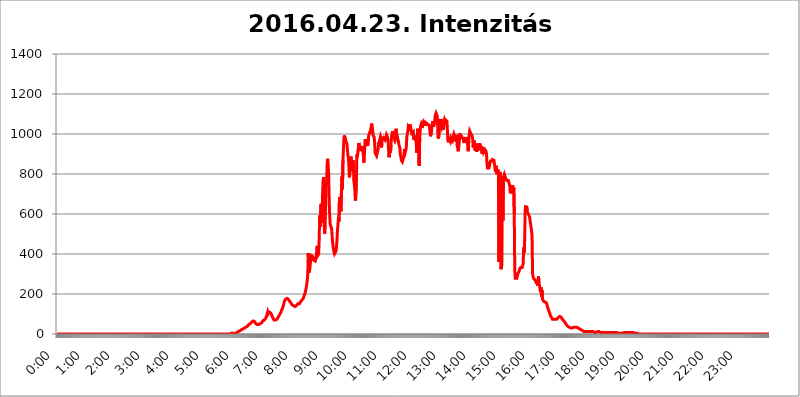
| Category | 2016.04.23. Intenzitás [W/m^2] |
|---|---|
| 0.0 | 0 |
| 0.0006944444444444445 | 0 |
| 0.001388888888888889 | 0 |
| 0.0020833333333333333 | 0 |
| 0.002777777777777778 | 0 |
| 0.003472222222222222 | 0 |
| 0.004166666666666667 | 0 |
| 0.004861111111111111 | 0 |
| 0.005555555555555556 | 0 |
| 0.0062499999999999995 | 0 |
| 0.006944444444444444 | 0 |
| 0.007638888888888889 | 0 |
| 0.008333333333333333 | 0 |
| 0.009027777777777779 | 0 |
| 0.009722222222222222 | 0 |
| 0.010416666666666666 | 0 |
| 0.011111111111111112 | 0 |
| 0.011805555555555555 | 0 |
| 0.012499999999999999 | 0 |
| 0.013194444444444444 | 0 |
| 0.013888888888888888 | 0 |
| 0.014583333333333332 | 0 |
| 0.015277777777777777 | 0 |
| 0.015972222222222224 | 0 |
| 0.016666666666666666 | 0 |
| 0.017361111111111112 | 0 |
| 0.018055555555555557 | 0 |
| 0.01875 | 0 |
| 0.019444444444444445 | 0 |
| 0.02013888888888889 | 0 |
| 0.020833333333333332 | 0 |
| 0.02152777777777778 | 0 |
| 0.022222222222222223 | 0 |
| 0.02291666666666667 | 0 |
| 0.02361111111111111 | 0 |
| 0.024305555555555556 | 0 |
| 0.024999999999999998 | 0 |
| 0.025694444444444447 | 0 |
| 0.02638888888888889 | 0 |
| 0.027083333333333334 | 0 |
| 0.027777777777777776 | 0 |
| 0.02847222222222222 | 0 |
| 0.029166666666666664 | 0 |
| 0.029861111111111113 | 0 |
| 0.030555555555555555 | 0 |
| 0.03125 | 0 |
| 0.03194444444444445 | 0 |
| 0.03263888888888889 | 0 |
| 0.03333333333333333 | 0 |
| 0.034027777777777775 | 0 |
| 0.034722222222222224 | 0 |
| 0.035416666666666666 | 0 |
| 0.036111111111111115 | 0 |
| 0.03680555555555556 | 0 |
| 0.0375 | 0 |
| 0.03819444444444444 | 0 |
| 0.03888888888888889 | 0 |
| 0.03958333333333333 | 0 |
| 0.04027777777777778 | 0 |
| 0.04097222222222222 | 0 |
| 0.041666666666666664 | 0 |
| 0.042361111111111106 | 0 |
| 0.04305555555555556 | 0 |
| 0.043750000000000004 | 0 |
| 0.044444444444444446 | 0 |
| 0.04513888888888889 | 0 |
| 0.04583333333333334 | 0 |
| 0.04652777777777778 | 0 |
| 0.04722222222222222 | 0 |
| 0.04791666666666666 | 0 |
| 0.04861111111111111 | 0 |
| 0.049305555555555554 | 0 |
| 0.049999999999999996 | 0 |
| 0.05069444444444445 | 0 |
| 0.051388888888888894 | 0 |
| 0.052083333333333336 | 0 |
| 0.05277777777777778 | 0 |
| 0.05347222222222222 | 0 |
| 0.05416666666666667 | 0 |
| 0.05486111111111111 | 0 |
| 0.05555555555555555 | 0 |
| 0.05625 | 0 |
| 0.05694444444444444 | 0 |
| 0.057638888888888885 | 0 |
| 0.05833333333333333 | 0 |
| 0.05902777777777778 | 0 |
| 0.059722222222222225 | 0 |
| 0.06041666666666667 | 0 |
| 0.061111111111111116 | 0 |
| 0.06180555555555556 | 0 |
| 0.0625 | 0 |
| 0.06319444444444444 | 0 |
| 0.06388888888888888 | 0 |
| 0.06458333333333334 | 0 |
| 0.06527777777777778 | 0 |
| 0.06597222222222222 | 0 |
| 0.06666666666666667 | 0 |
| 0.06736111111111111 | 0 |
| 0.06805555555555555 | 0 |
| 0.06874999999999999 | 0 |
| 0.06944444444444443 | 0 |
| 0.07013888888888889 | 0 |
| 0.07083333333333333 | 0 |
| 0.07152777777777779 | 0 |
| 0.07222222222222223 | 0 |
| 0.07291666666666667 | 0 |
| 0.07361111111111111 | 0 |
| 0.07430555555555556 | 0 |
| 0.075 | 0 |
| 0.07569444444444444 | 0 |
| 0.0763888888888889 | 0 |
| 0.07708333333333334 | 0 |
| 0.07777777777777778 | 0 |
| 0.07847222222222222 | 0 |
| 0.07916666666666666 | 0 |
| 0.0798611111111111 | 0 |
| 0.08055555555555556 | 0 |
| 0.08125 | 0 |
| 0.08194444444444444 | 0 |
| 0.08263888888888889 | 0 |
| 0.08333333333333333 | 0 |
| 0.08402777777777777 | 0 |
| 0.08472222222222221 | 0 |
| 0.08541666666666665 | 0 |
| 0.08611111111111112 | 0 |
| 0.08680555555555557 | 0 |
| 0.08750000000000001 | 0 |
| 0.08819444444444445 | 0 |
| 0.08888888888888889 | 0 |
| 0.08958333333333333 | 0 |
| 0.09027777777777778 | 0 |
| 0.09097222222222222 | 0 |
| 0.09166666666666667 | 0 |
| 0.09236111111111112 | 0 |
| 0.09305555555555556 | 0 |
| 0.09375 | 0 |
| 0.09444444444444444 | 0 |
| 0.09513888888888888 | 0 |
| 0.09583333333333333 | 0 |
| 0.09652777777777777 | 0 |
| 0.09722222222222222 | 0 |
| 0.09791666666666667 | 0 |
| 0.09861111111111111 | 0 |
| 0.09930555555555555 | 0 |
| 0.09999999999999999 | 0 |
| 0.10069444444444443 | 0 |
| 0.1013888888888889 | 0 |
| 0.10208333333333335 | 0 |
| 0.10277777777777779 | 0 |
| 0.10347222222222223 | 0 |
| 0.10416666666666667 | 0 |
| 0.10486111111111111 | 0 |
| 0.10555555555555556 | 0 |
| 0.10625 | 0 |
| 0.10694444444444444 | 0 |
| 0.1076388888888889 | 0 |
| 0.10833333333333334 | 0 |
| 0.10902777777777778 | 0 |
| 0.10972222222222222 | 0 |
| 0.1111111111111111 | 0 |
| 0.11180555555555556 | 0 |
| 0.11180555555555556 | 0 |
| 0.1125 | 0 |
| 0.11319444444444444 | 0 |
| 0.11388888888888889 | 0 |
| 0.11458333333333333 | 0 |
| 0.11527777777777777 | 0 |
| 0.11597222222222221 | 0 |
| 0.11666666666666665 | 0 |
| 0.1173611111111111 | 0 |
| 0.11805555555555557 | 0 |
| 0.11944444444444445 | 0 |
| 0.12013888888888889 | 0 |
| 0.12083333333333333 | 0 |
| 0.12152777777777778 | 0 |
| 0.12222222222222223 | 0 |
| 0.12291666666666667 | 0 |
| 0.12291666666666667 | 0 |
| 0.12361111111111112 | 0 |
| 0.12430555555555556 | 0 |
| 0.125 | 0 |
| 0.12569444444444444 | 0 |
| 0.12638888888888888 | 0 |
| 0.12708333333333333 | 0 |
| 0.16875 | 0 |
| 0.12847222222222224 | 0 |
| 0.12916666666666668 | 0 |
| 0.12986111111111112 | 0 |
| 0.13055555555555556 | 0 |
| 0.13125 | 0 |
| 0.13194444444444445 | 0 |
| 0.1326388888888889 | 0 |
| 0.13333333333333333 | 0 |
| 0.13402777777777777 | 0 |
| 0.13402777777777777 | 0 |
| 0.13472222222222222 | 0 |
| 0.13541666666666666 | 0 |
| 0.1361111111111111 | 0 |
| 0.13749999999999998 | 0 |
| 0.13819444444444443 | 0 |
| 0.1388888888888889 | 0 |
| 0.13958333333333334 | 0 |
| 0.14027777777777778 | 0 |
| 0.14097222222222222 | 0 |
| 0.14166666666666666 | 0 |
| 0.1423611111111111 | 0 |
| 0.14305555555555557 | 0 |
| 0.14375000000000002 | 0 |
| 0.14444444444444446 | 0 |
| 0.1451388888888889 | 0 |
| 0.1451388888888889 | 0 |
| 0.14652777777777778 | 0 |
| 0.14722222222222223 | 0 |
| 0.14791666666666667 | 0 |
| 0.1486111111111111 | 0 |
| 0.14930555555555555 | 0 |
| 0.15 | 0 |
| 0.15069444444444444 | 0 |
| 0.15138888888888888 | 0 |
| 0.15208333333333332 | 0 |
| 0.15277777777777776 | 0 |
| 0.15347222222222223 | 0 |
| 0.15416666666666667 | 0 |
| 0.15486111111111112 | 0 |
| 0.15555555555555556 | 0 |
| 0.15625 | 0 |
| 0.15694444444444444 | 0 |
| 0.15763888888888888 | 0 |
| 0.15833333333333333 | 0 |
| 0.15902777777777777 | 0 |
| 0.15972222222222224 | 0 |
| 0.16041666666666668 | 0 |
| 0.16111111111111112 | 0 |
| 0.16180555555555556 | 0 |
| 0.1625 | 0 |
| 0.16319444444444445 | 0 |
| 0.1638888888888889 | 0 |
| 0.16458333333333333 | 0 |
| 0.16527777777777777 | 0 |
| 0.16597222222222222 | 0 |
| 0.16666666666666666 | 0 |
| 0.1673611111111111 | 0 |
| 0.16805555555555554 | 0 |
| 0.16874999999999998 | 0 |
| 0.16944444444444443 | 0 |
| 0.17013888888888887 | 0 |
| 0.1708333333333333 | 0 |
| 0.17152777777777775 | 0 |
| 0.17222222222222225 | 0 |
| 0.1729166666666667 | 0 |
| 0.17361111111111113 | 0 |
| 0.17430555555555557 | 0 |
| 0.17500000000000002 | 0 |
| 0.17569444444444446 | 0 |
| 0.1763888888888889 | 0 |
| 0.17708333333333334 | 0 |
| 0.17777777777777778 | 0 |
| 0.17847222222222223 | 0 |
| 0.17916666666666667 | 0 |
| 0.1798611111111111 | 0 |
| 0.18055555555555555 | 0 |
| 0.18125 | 0 |
| 0.18194444444444444 | 0 |
| 0.1826388888888889 | 0 |
| 0.18333333333333335 | 0 |
| 0.1840277777777778 | 0 |
| 0.18472222222222223 | 0 |
| 0.18541666666666667 | 0 |
| 0.18611111111111112 | 0 |
| 0.18680555555555556 | 0 |
| 0.1875 | 0 |
| 0.18819444444444444 | 0 |
| 0.18888888888888888 | 0 |
| 0.18958333333333333 | 0 |
| 0.19027777777777777 | 0 |
| 0.1909722222222222 | 0 |
| 0.19166666666666665 | 0 |
| 0.19236111111111112 | 0 |
| 0.19305555555555554 | 0 |
| 0.19375 | 0 |
| 0.19444444444444445 | 0 |
| 0.1951388888888889 | 0 |
| 0.19583333333333333 | 0 |
| 0.19652777777777777 | 0 |
| 0.19722222222222222 | 0 |
| 0.19791666666666666 | 0 |
| 0.1986111111111111 | 0 |
| 0.19930555555555554 | 0 |
| 0.19999999999999998 | 0 |
| 0.20069444444444443 | 0 |
| 0.20138888888888887 | 0 |
| 0.2020833333333333 | 0 |
| 0.2027777777777778 | 0 |
| 0.2034722222222222 | 0 |
| 0.2041666666666667 | 0 |
| 0.20486111111111113 | 0 |
| 0.20555555555555557 | 0 |
| 0.20625000000000002 | 0 |
| 0.20694444444444446 | 0 |
| 0.2076388888888889 | 0 |
| 0.20833333333333334 | 0 |
| 0.20902777777777778 | 0 |
| 0.20972222222222223 | 0 |
| 0.21041666666666667 | 0 |
| 0.2111111111111111 | 0 |
| 0.21180555555555555 | 0 |
| 0.2125 | 0 |
| 0.21319444444444444 | 0 |
| 0.2138888888888889 | 0 |
| 0.21458333333333335 | 0 |
| 0.2152777777777778 | 0 |
| 0.21597222222222223 | 0 |
| 0.21666666666666667 | 0 |
| 0.21736111111111112 | 0 |
| 0.21805555555555556 | 0 |
| 0.21875 | 0 |
| 0.21944444444444444 | 0 |
| 0.22013888888888888 | 0 |
| 0.22083333333333333 | 0 |
| 0.22152777777777777 | 0 |
| 0.2222222222222222 | 0 |
| 0.22291666666666665 | 0 |
| 0.2236111111111111 | 0 |
| 0.22430555555555556 | 0 |
| 0.225 | 0 |
| 0.22569444444444445 | 0 |
| 0.2263888888888889 | 0 |
| 0.22708333333333333 | 0 |
| 0.22777777777777777 | 0 |
| 0.22847222222222222 | 0 |
| 0.22916666666666666 | 0 |
| 0.2298611111111111 | 0 |
| 0.23055555555555554 | 0 |
| 0.23124999999999998 | 0 |
| 0.23194444444444443 | 0 |
| 0.23263888888888887 | 0 |
| 0.2333333333333333 | 0 |
| 0.2340277777777778 | 0 |
| 0.2347222222222222 | 0 |
| 0.2354166666666667 | 0 |
| 0.23611111111111113 | 0 |
| 0.23680555555555557 | 0 |
| 0.23750000000000002 | 0 |
| 0.23819444444444446 | 0 |
| 0.2388888888888889 | 0 |
| 0.23958333333333334 | 0 |
| 0.24027777777777778 | 0 |
| 0.24097222222222223 | 0 |
| 0.24166666666666667 | 0 |
| 0.2423611111111111 | 0 |
| 0.24305555555555555 | 3.525 |
| 0.24375 | 3.525 |
| 0.24444444444444446 | 3.525 |
| 0.24513888888888888 | 3.525 |
| 0.24583333333333335 | 3.525 |
| 0.2465277777777778 | 3.525 |
| 0.24722222222222223 | 3.525 |
| 0.24791666666666667 | 3.525 |
| 0.24861111111111112 | 3.525 |
| 0.24930555555555556 | 3.525 |
| 0.25 | 3.525 |
| 0.25069444444444444 | 3.525 |
| 0.2513888888888889 | 7.887 |
| 0.2520833333333333 | 7.887 |
| 0.25277777777777777 | 7.887 |
| 0.2534722222222222 | 12.257 |
| 0.25416666666666665 | 12.257 |
| 0.2548611111111111 | 12.257 |
| 0.2555555555555556 | 12.257 |
| 0.25625000000000003 | 16.636 |
| 0.2569444444444445 | 16.636 |
| 0.2576388888888889 | 16.636 |
| 0.25833333333333336 | 21.024 |
| 0.2590277777777778 | 21.024 |
| 0.25972222222222224 | 25.419 |
| 0.2604166666666667 | 25.419 |
| 0.2611111111111111 | 29.823 |
| 0.26180555555555557 | 29.823 |
| 0.2625 | 29.823 |
| 0.26319444444444445 | 29.823 |
| 0.2638888888888889 | 29.823 |
| 0.26458333333333334 | 34.234 |
| 0.2652777777777778 | 34.234 |
| 0.2659722222222222 | 38.653 |
| 0.26666666666666666 | 38.653 |
| 0.2673611111111111 | 38.653 |
| 0.26805555555555555 | 43.079 |
| 0.26875 | 47.511 |
| 0.26944444444444443 | 47.511 |
| 0.2701388888888889 | 51.951 |
| 0.2708333333333333 | 51.951 |
| 0.27152777777777776 | 56.398 |
| 0.2722222222222222 | 56.398 |
| 0.27291666666666664 | 60.85 |
| 0.2736111111111111 | 60.85 |
| 0.2743055555555555 | 65.31 |
| 0.27499999999999997 | 65.31 |
| 0.27569444444444446 | 60.85 |
| 0.27638888888888885 | 60.85 |
| 0.27708333333333335 | 60.85 |
| 0.2777777777777778 | 56.398 |
| 0.27847222222222223 | 51.951 |
| 0.2791666666666667 | 51.951 |
| 0.2798611111111111 | 47.511 |
| 0.28055555555555556 | 47.511 |
| 0.28125 | 47.511 |
| 0.28194444444444444 | 47.511 |
| 0.2826388888888889 | 47.511 |
| 0.2833333333333333 | 47.511 |
| 0.28402777777777777 | 47.511 |
| 0.2847222222222222 | 51.951 |
| 0.28541666666666665 | 56.398 |
| 0.28611111111111115 | 56.398 |
| 0.28680555555555554 | 56.398 |
| 0.28750000000000003 | 60.85 |
| 0.2881944444444445 | 65.31 |
| 0.2888888888888889 | 65.31 |
| 0.28958333333333336 | 69.775 |
| 0.2902777777777778 | 69.775 |
| 0.29097222222222224 | 74.246 |
| 0.2916666666666667 | 74.246 |
| 0.2923611111111111 | 78.722 |
| 0.29305555555555557 | 83.205 |
| 0.29375 | 92.184 |
| 0.29444444444444445 | 96.682 |
| 0.2951388888888889 | 110.201 |
| 0.29583333333333334 | 101.184 |
| 0.2965277777777778 | 101.184 |
| 0.2972222222222222 | 110.201 |
| 0.29791666666666666 | 114.716 |
| 0.2986111111111111 | 105.69 |
| 0.29930555555555555 | 105.69 |
| 0.3 | 101.184 |
| 0.30069444444444443 | 96.682 |
| 0.3013888888888889 | 87.692 |
| 0.3020833333333333 | 83.205 |
| 0.30277777777777776 | 78.722 |
| 0.3034722222222222 | 74.246 |
| 0.30416666666666664 | 69.775 |
| 0.3048611111111111 | 69.775 |
| 0.3055555555555555 | 69.775 |
| 0.30624999999999997 | 69.775 |
| 0.3069444444444444 | 69.775 |
| 0.3076388888888889 | 74.246 |
| 0.30833333333333335 | 74.246 |
| 0.3090277777777778 | 78.722 |
| 0.30972222222222223 | 83.205 |
| 0.3104166666666667 | 87.692 |
| 0.3111111111111111 | 92.184 |
| 0.31180555555555556 | 96.682 |
| 0.3125 | 101.184 |
| 0.31319444444444444 | 105.69 |
| 0.3138888888888889 | 110.201 |
| 0.3145833333333333 | 119.235 |
| 0.31527777777777777 | 123.758 |
| 0.3159722222222222 | 128.284 |
| 0.31666666666666665 | 137.347 |
| 0.31736111111111115 | 146.423 |
| 0.31805555555555554 | 155.509 |
| 0.31875000000000003 | 164.605 |
| 0.3194444444444445 | 169.156 |
| 0.3201388888888889 | 173.709 |
| 0.32083333333333336 | 173.709 |
| 0.3215277777777778 | 178.264 |
| 0.32222222222222224 | 178.264 |
| 0.3229166666666667 | 178.264 |
| 0.3236111111111111 | 178.264 |
| 0.32430555555555557 | 173.709 |
| 0.325 | 169.156 |
| 0.32569444444444445 | 164.605 |
| 0.3263888888888889 | 160.056 |
| 0.32708333333333334 | 160.056 |
| 0.3277777777777778 | 155.509 |
| 0.3284722222222222 | 150.964 |
| 0.32916666666666666 | 146.423 |
| 0.3298611111111111 | 146.423 |
| 0.33055555555555555 | 141.884 |
| 0.33125 | 141.884 |
| 0.33194444444444443 | 137.347 |
| 0.3326388888888889 | 137.347 |
| 0.3333333333333333 | 137.347 |
| 0.3340277777777778 | 137.347 |
| 0.3347222222222222 | 141.884 |
| 0.3354166666666667 | 141.884 |
| 0.3361111111111111 | 146.423 |
| 0.3368055555555556 | 146.423 |
| 0.33749999999999997 | 150.964 |
| 0.33819444444444446 | 150.964 |
| 0.33888888888888885 | 150.964 |
| 0.33958333333333335 | 150.964 |
| 0.34027777777777773 | 155.509 |
| 0.34097222222222223 | 160.056 |
| 0.3416666666666666 | 160.056 |
| 0.3423611111111111 | 164.605 |
| 0.3430555555555555 | 169.156 |
| 0.34375 | 173.709 |
| 0.3444444444444445 | 173.709 |
| 0.3451388888888889 | 178.264 |
| 0.3458333333333334 | 187.378 |
| 0.34652777777777777 | 191.937 |
| 0.34722222222222227 | 201.058 |
| 0.34791666666666665 | 210.182 |
| 0.34861111111111115 | 219.309 |
| 0.34930555555555554 | 233 |
| 0.35000000000000003 | 251.251 |
| 0.3506944444444444 | 269.49 |
| 0.3513888888888889 | 301.354 |
| 0.3520833333333333 | 405.108 |
| 0.3527777777777778 | 305.898 |
| 0.3534722222222222 | 305.898 |
| 0.3541666666666667 | 324.052 |
| 0.3548611111111111 | 346.682 |
| 0.35555555555555557 | 373.729 |
| 0.35625 | 391.685 |
| 0.35694444444444445 | 396.164 |
| 0.3576388888888889 | 396.164 |
| 0.35833333333333334 | 387.202 |
| 0.3590277777777778 | 378.224 |
| 0.3597222222222222 | 369.23 |
| 0.36041666666666666 | 364.728 |
| 0.3611111111111111 | 364.728 |
| 0.36180555555555555 | 364.728 |
| 0.3625 | 369.23 |
| 0.36319444444444443 | 387.202 |
| 0.3638888888888889 | 414.035 |
| 0.3645833333333333 | 440.702 |
| 0.3652777777777778 | 391.685 |
| 0.3659722222222222 | 387.202 |
| 0.3666666666666667 | 400.638 |
| 0.3673611111111111 | 471.582 |
| 0.3680555555555556 | 592.233 |
| 0.36874999999999997 | 536.82 |
| 0.36944444444444446 | 541.121 |
| 0.37013888888888885 | 650.667 |
| 0.37083333333333335 | 558.261 |
| 0.37152777777777773 | 617.436 |
| 0.37222222222222223 | 703.762 |
| 0.3729166666666666 | 767.62 |
| 0.3736111111111111 | 783.342 |
| 0.3743055555555555 | 558.261 |
| 0.375 | 502.192 |
| 0.3756944444444445 | 545.416 |
| 0.3763888888888889 | 629.948 |
| 0.3770833333333334 | 731.896 |
| 0.37777777777777777 | 755.766 |
| 0.37847222222222227 | 845.365 |
| 0.37916666666666665 | 875.918 |
| 0.37986111111111115 | 833.834 |
| 0.38055555555555554 | 818.392 |
| 0.38125000000000003 | 691.608 |
| 0.3819444444444444 | 609.062 |
| 0.3826388888888889 | 553.986 |
| 0.3833333333333333 | 541.121 |
| 0.3840277777777778 | 536.82 |
| 0.3847222222222222 | 528.2 |
| 0.3854166666666667 | 497.836 |
| 0.3861111111111111 | 462.786 |
| 0.38680555555555557 | 440.702 |
| 0.3875 | 422.943 |
| 0.38819444444444445 | 409.574 |
| 0.3888888888888889 | 400.638 |
| 0.38958333333333334 | 396.164 |
| 0.3902777777777778 | 405.108 |
| 0.3909722222222222 | 414.035 |
| 0.39166666666666666 | 436.27 |
| 0.3923611111111111 | 471.582 |
| 0.39305555555555555 | 519.555 |
| 0.39375 | 549.704 |
| 0.39444444444444443 | 583.779 |
| 0.3951388888888889 | 562.53 |
| 0.3958333333333333 | 683.473 |
| 0.3965277777777778 | 658.909 |
| 0.3972222222222222 | 663.019 |
| 0.3979166666666667 | 613.252 |
| 0.3986111111111111 | 715.858 |
| 0.3993055555555556 | 787.258 |
| 0.39999999999999997 | 723.889 |
| 0.40069444444444446 | 868.305 |
| 0.40138888888888885 | 921.298 |
| 0.40208333333333335 | 977.508 |
| 0.40277777777777773 | 992.448 |
| 0.40347222222222223 | 992.448 |
| 0.4041666666666666 | 996.182 |
| 0.4048611111111111 | 962.555 |
| 0.4055555555555555 | 966.295 |
| 0.40625 | 951.327 |
| 0.4069444444444445 | 955.071 |
| 0.4076388888888889 | 894.885 |
| 0.4083333333333334 | 883.516 |
| 0.40902777777777777 | 837.682 |
| 0.40972222222222227 | 783.342 |
| 0.41041666666666665 | 802.868 |
| 0.41111111111111115 | 875.918 |
| 0.41180555555555554 | 887.309 |
| 0.41250000000000003 | 872.114 |
| 0.4131944444444444 | 837.682 |
| 0.4138888888888889 | 814.519 |
| 0.4145833333333333 | 868.305 |
| 0.4152777777777778 | 856.855 |
| 0.4159722222222222 | 767.62 |
| 0.4166666666666667 | 767.62 |
| 0.4173611111111111 | 723.889 |
| 0.41805555555555557 | 667.123 |
| 0.41875 | 683.473 |
| 0.41944444444444445 | 719.877 |
| 0.4201388888888889 | 898.668 |
| 0.42083333333333334 | 891.099 |
| 0.4215277777777778 | 902.447 |
| 0.4222222222222222 | 928.819 |
| 0.42291666666666666 | 955.071 |
| 0.4236111111111111 | 925.06 |
| 0.42430555555555555 | 932.576 |
| 0.425 | 921.298 |
| 0.42569444444444443 | 917.534 |
| 0.4263888888888889 | 921.298 |
| 0.4270833333333333 | 921.298 |
| 0.4277777777777778 | 932.576 |
| 0.4284722222222222 | 940.082 |
| 0.4291666666666667 | 902.447 |
| 0.4298611111111111 | 856.855 |
| 0.4305555555555556 | 883.516 |
| 0.43124999999999997 | 883.516 |
| 0.43194444444444446 | 973.772 |
| 0.43263888888888885 | 958.814 |
| 0.43333333333333335 | 973.772 |
| 0.43402777777777773 | 962.555 |
| 0.43472222222222223 | 947.58 |
| 0.4354166666666666 | 940.082 |
| 0.4361111111111111 | 943.832 |
| 0.4368055555555555 | 992.448 |
| 0.4375 | 988.714 |
| 0.4381944444444445 | 1007.383 |
| 0.4388888888888889 | 1014.852 |
| 0.4395833333333334 | 999.916 |
| 0.44027777777777777 | 1033.537 |
| 0.44097222222222227 | 1052.255 |
| 0.44166666666666665 | 1029.798 |
| 0.44236111111111115 | 1022.323 |
| 0.44305555555555554 | 992.448 |
| 0.44375000000000003 | 988.714 |
| 0.4444444444444444 | 984.98 |
| 0.4451388888888889 | 958.814 |
| 0.4458333333333333 | 906.223 |
| 0.4465277777777778 | 902.447 |
| 0.4472222222222222 | 902.447 |
| 0.4479166666666667 | 891.099 |
| 0.4486111111111111 | 894.885 |
| 0.44930555555555557 | 887.309 |
| 0.45 | 921.298 |
| 0.45069444444444445 | 955.071 |
| 0.4513888888888889 | 955.071 |
| 0.45208333333333334 | 966.295 |
| 0.4527777777777778 | 977.508 |
| 0.4534722222222222 | 988.714 |
| 0.45416666666666666 | 981.244 |
| 0.4548611111111111 | 932.576 |
| 0.45555555555555555 | 984.98 |
| 0.45625 | 973.772 |
| 0.45694444444444443 | 977.508 |
| 0.4576388888888889 | 981.244 |
| 0.4583333333333333 | 981.244 |
| 0.4590277777777778 | 977.508 |
| 0.4597222222222222 | 970.034 |
| 0.4604166666666667 | 973.772 |
| 0.4611111111111111 | 984.98 |
| 0.4618055555555556 | 996.182 |
| 0.46249999999999997 | 992.448 |
| 0.46319444444444446 | 984.98 |
| 0.46388888888888885 | 970.034 |
| 0.46458333333333335 | 932.576 |
| 0.46527777777777773 | 883.516 |
| 0.46597222222222223 | 887.309 |
| 0.4666666666666666 | 925.06 |
| 0.4673611111111111 | 906.223 |
| 0.4680555555555555 | 943.832 |
| 0.46875 | 984.98 |
| 0.4694444444444445 | 999.916 |
| 0.4701388888888889 | 1014.852 |
| 0.4708333333333334 | 996.182 |
| 0.47152777777777777 | 984.98 |
| 0.47222222222222227 | 984.98 |
| 0.47291666666666665 | 984.98 |
| 0.47361111111111115 | 966.295 |
| 0.47430555555555554 | 973.772 |
| 0.47500000000000003 | 1026.06 |
| 0.4756944444444444 | 1007.383 |
| 0.4763888888888889 | 996.182 |
| 0.4770833333333333 | 996.182 |
| 0.4777777777777778 | 973.772 |
| 0.4784722222222222 | 962.555 |
| 0.4791666666666667 | 947.58 |
| 0.4798611111111111 | 951.327 |
| 0.48055555555555557 | 928.819 |
| 0.48125 | 894.885 |
| 0.48194444444444445 | 887.309 |
| 0.4826388888888889 | 868.305 |
| 0.48333333333333334 | 868.305 |
| 0.4840277777777778 | 860.676 |
| 0.4847222222222222 | 856.855 |
| 0.48541666666666666 | 864.493 |
| 0.4861111111111111 | 887.309 |
| 0.48680555555555555 | 925.06 |
| 0.4875 | 917.534 |
| 0.48819444444444443 | 909.996 |
| 0.4888888888888889 | 909.996 |
| 0.4895833333333333 | 932.576 |
| 0.4902777777777778 | 984.98 |
| 0.4909722222222222 | 999.916 |
| 0.4916666666666667 | 1014.852 |
| 0.4923611111111111 | 1037.277 |
| 0.4930555555555556 | 1037.277 |
| 0.49374999999999997 | 1029.798 |
| 0.49444444444444446 | 1048.508 |
| 0.49513888888888885 | 1041.019 |
| 0.49583333333333335 | 1029.798 |
| 0.49652777777777773 | 1014.852 |
| 0.49722222222222223 | 1003.65 |
| 0.4979166666666666 | 1007.383 |
| 0.4986111111111111 | 1007.383 |
| 0.4993055555555555 | 1011.118 |
| 0.5 | 970.034 |
| 0.5006944444444444 | 966.295 |
| 0.5013888888888889 | 981.244 |
| 0.5020833333333333 | 984.98 |
| 0.5027777777777778 | 992.448 |
| 0.5034722222222222 | 958.814 |
| 0.5041666666666667 | 906.223 |
| 0.5048611111111111 | 909.996 |
| 0.5055555555555555 | 1026.06 |
| 0.50625 | 958.814 |
| 0.5069444444444444 | 970.034 |
| 0.5076388888888889 | 841.526 |
| 0.5083333333333333 | 977.508 |
| 0.5090277777777777 | 1018.587 |
| 0.5097222222222222 | 1041.019 |
| 0.5104166666666666 | 1048.508 |
| 0.5111111111111112 | 1048.508 |
| 0.5118055555555555 | 1029.798 |
| 0.5125000000000001 | 1052.255 |
| 0.5131944444444444 | 1056.004 |
| 0.513888888888889 | 1063.51 |
| 0.5145833333333333 | 1059.756 |
| 0.5152777777777778 | 1056.004 |
| 0.5159722222222222 | 1041.019 |
| 0.5166666666666667 | 1041.019 |
| 0.517361111111111 | 1056.004 |
| 0.5180555555555556 | 1059.756 |
| 0.5187499999999999 | 1056.004 |
| 0.5194444444444445 | 1048.508 |
| 0.5201388888888888 | 1052.255 |
| 0.5208333333333334 | 1044.762 |
| 0.5215277777777778 | 1044.762 |
| 0.5222222222222223 | 1029.798 |
| 0.5229166666666667 | 1007.383 |
| 0.5236111111111111 | 988.714 |
| 0.5243055555555556 | 992.448 |
| 0.525 | 1018.587 |
| 0.5256944444444445 | 1041.019 |
| 0.5263888888888889 | 1056.004 |
| 0.5270833333333333 | 1063.51 |
| 0.5277777777777778 | 1037.277 |
| 0.5284722222222222 | 1044.762 |
| 0.5291666666666667 | 1059.756 |
| 0.5298611111111111 | 1082.324 |
| 0.5305555555555556 | 1097.437 |
| 0.53125 | 1105.019 |
| 0.5319444444444444 | 1101.226 |
| 0.5326388888888889 | 1093.653 |
| 0.5333333333333333 | 1063.51 |
| 0.5340277777777778 | 984.98 |
| 0.5347222222222222 | 977.508 |
| 0.5354166666666667 | 1003.65 |
| 0.5361111111111111 | 1022.323 |
| 0.5368055555555555 | 1074.789 |
| 0.5375 | 1059.756 |
| 0.5381944444444444 | 1074.789 |
| 0.5388888888888889 | 1044.762 |
| 0.5395833333333333 | 1033.537 |
| 0.5402777777777777 | 1033.537 |
| 0.5409722222222222 | 1048.508 |
| 0.5416666666666666 | 1022.323 |
| 0.5423611111111112 | 1059.756 |
| 0.5430555555555555 | 1071.027 |
| 0.5437500000000001 | 1063.51 |
| 0.5444444444444444 | 1071.027 |
| 0.545138888888889 | 1074.789 |
| 0.5458333333333333 | 1071.027 |
| 0.5465277777777778 | 1063.51 |
| 0.5472222222222222 | 1018.587 |
| 0.5479166666666667 | 966.295 |
| 0.548611111111111 | 958.814 |
| 0.5493055555555556 | 984.98 |
| 0.5499999999999999 | 984.98 |
| 0.5506944444444445 | 970.034 |
| 0.5513888888888888 | 977.508 |
| 0.5520833333333334 | 966.295 |
| 0.5527777777777778 | 973.772 |
| 0.5534722222222223 | 970.034 |
| 0.5541666666666667 | 966.295 |
| 0.5548611111111111 | 981.244 |
| 0.5555555555555556 | 984.98 |
| 0.55625 | 999.916 |
| 0.5569444444444445 | 999.916 |
| 0.5576388888888889 | 996.182 |
| 0.5583333333333333 | 977.508 |
| 0.5590277777777778 | 962.555 |
| 0.5597222222222222 | 973.772 |
| 0.5604166666666667 | 996.182 |
| 0.5611111111111111 | 940.082 |
| 0.5618055555555556 | 940.082 |
| 0.5625 | 913.766 |
| 0.5631944444444444 | 943.832 |
| 0.5638888888888889 | 962.555 |
| 0.5645833333333333 | 1003.65 |
| 0.5652777777777778 | 992.448 |
| 0.5659722222222222 | 977.508 |
| 0.5666666666666667 | 992.448 |
| 0.5673611111111111 | 984.98 |
| 0.5680555555555555 | 984.98 |
| 0.56875 | 977.508 |
| 0.5694444444444444 | 984.98 |
| 0.5701388888888889 | 962.555 |
| 0.5708333333333333 | 955.071 |
| 0.5715277777777777 | 973.772 |
| 0.5722222222222222 | 984.98 |
| 0.5729166666666666 | 966.295 |
| 0.5736111111111112 | 955.071 |
| 0.5743055555555555 | 984.98 |
| 0.5750000000000001 | 970.034 |
| 0.5756944444444444 | 970.034 |
| 0.576388888888889 | 913.766 |
| 0.5770833333333333 | 962.555 |
| 0.5777777777777778 | 996.182 |
| 0.5784722222222222 | 1014.852 |
| 0.5791666666666667 | 1011.118 |
| 0.579861111111111 | 1003.65 |
| 0.5805555555555556 | 999.916 |
| 0.5812499999999999 | 999.916 |
| 0.5819444444444445 | 988.714 |
| 0.5826388888888888 | 977.508 |
| 0.5833333333333334 | 932.576 |
| 0.5840277777777778 | 947.58 |
| 0.5847222222222223 | 966.295 |
| 0.5854166666666667 | 951.327 |
| 0.5861111111111111 | 917.534 |
| 0.5868055555555556 | 951.327 |
| 0.5875 | 940.082 |
| 0.5881944444444445 | 909.996 |
| 0.5888888888888889 | 947.58 |
| 0.5895833333333333 | 917.534 |
| 0.5902777777777778 | 940.082 |
| 0.5909722222222222 | 947.58 |
| 0.5916666666666667 | 943.832 |
| 0.5923611111111111 | 943.832 |
| 0.5930555555555556 | 947.58 |
| 0.59375 | 940.082 |
| 0.5944444444444444 | 917.534 |
| 0.5951388888888889 | 940.082 |
| 0.5958333333333333 | 902.447 |
| 0.5965277777777778 | 932.576 |
| 0.5972222222222222 | 928.819 |
| 0.5979166666666667 | 906.223 |
| 0.5986111111111111 | 902.447 |
| 0.5993055555555555 | 913.766 |
| 0.6 | 921.298 |
| 0.6006944444444444 | 921.298 |
| 0.6013888888888889 | 913.766 |
| 0.6020833333333333 | 898.668 |
| 0.6027777777777777 | 849.199 |
| 0.6034722222222222 | 829.981 |
| 0.6041666666666666 | 829.981 |
| 0.6048611111111112 | 826.123 |
| 0.6055555555555555 | 829.981 |
| 0.6062500000000001 | 829.981 |
| 0.6069444444444444 | 856.855 |
| 0.607638888888889 | 864.493 |
| 0.6083333333333333 | 868.305 |
| 0.6090277777777778 | 864.493 |
| 0.6097222222222222 | 864.493 |
| 0.6104166666666667 | 872.114 |
| 0.611111111111111 | 872.114 |
| 0.6118055555555556 | 868.305 |
| 0.6124999999999999 | 868.305 |
| 0.6131944444444445 | 868.305 |
| 0.6138888888888888 | 864.493 |
| 0.6145833333333334 | 810.641 |
| 0.6152777777777778 | 841.526 |
| 0.6159722222222223 | 806.757 |
| 0.6166666666666667 | 798.974 |
| 0.6173611111111111 | 795.074 |
| 0.6180555555555556 | 822.26 |
| 0.61875 | 798.974 |
| 0.6194444444444445 | 360.221 |
| 0.6201388888888889 | 798.974 |
| 0.6208333333333333 | 810.641 |
| 0.6215277777777778 | 783.342 |
| 0.6222222222222222 | 324.052 |
| 0.6229166666666667 | 319.517 |
| 0.6236111111111111 | 351.198 |
| 0.6243055555555556 | 787.258 |
| 0.625 | 566.793 |
| 0.6256944444444444 | 783.342 |
| 0.6263888888888889 | 791.169 |
| 0.6270833333333333 | 798.974 |
| 0.6277777777777778 | 791.169 |
| 0.6284722222222222 | 783.342 |
| 0.6291666666666667 | 787.258 |
| 0.6298611111111111 | 787.258 |
| 0.6305555555555555 | 767.62 |
| 0.63125 | 767.62 |
| 0.6319444444444444 | 763.674 |
| 0.6326388888888889 | 767.62 |
| 0.6333333333333333 | 759.723 |
| 0.6340277777777777 | 755.766 |
| 0.6347222222222222 | 739.877 |
| 0.6354166666666666 | 703.762 |
| 0.6361111111111112 | 703.762 |
| 0.6368055555555555 | 723.889 |
| 0.6375000000000001 | 727.896 |
| 0.6381944444444444 | 735.89 |
| 0.638888888888889 | 743.859 |
| 0.6395833333333333 | 699.717 |
| 0.6402777777777778 | 731.896 |
| 0.6409722222222222 | 600.661 |
| 0.6416666666666667 | 319.517 |
| 0.642361111111111 | 278.603 |
| 0.6430555555555556 | 274.047 |
| 0.6437499999999999 | 278.603 |
| 0.6444444444444445 | 278.603 |
| 0.6451388888888888 | 287.709 |
| 0.6458333333333334 | 296.808 |
| 0.6465277777777778 | 305.898 |
| 0.6472222222222223 | 305.898 |
| 0.6479166666666667 | 314.98 |
| 0.6486111111111111 | 324.052 |
| 0.6493055555555556 | 328.584 |
| 0.65 | 333.113 |
| 0.6506944444444445 | 337.639 |
| 0.6513888888888889 | 337.639 |
| 0.6520833333333333 | 333.113 |
| 0.6527777777777778 | 337.639 |
| 0.6534722222222222 | 351.198 |
| 0.6541666666666667 | 431.833 |
| 0.6548611111111111 | 405.108 |
| 0.6555555555555556 | 471.582 |
| 0.65625 | 617.436 |
| 0.6569444444444444 | 642.4 |
| 0.6576388888888889 | 617.436 |
| 0.6583333333333333 | 638.256 |
| 0.6590277777777778 | 617.436 |
| 0.6597222222222222 | 617.436 |
| 0.6604166666666667 | 600.661 |
| 0.6611111111111111 | 600.661 |
| 0.6618055555555555 | 592.233 |
| 0.6625 | 583.779 |
| 0.6631944444444444 | 566.793 |
| 0.6638888888888889 | 549.704 |
| 0.6645833333333333 | 549.704 |
| 0.6652777777777777 | 515.223 |
| 0.6659722222222222 | 484.735 |
| 0.6666666666666666 | 301.354 |
| 0.6673611111111111 | 287.709 |
| 0.6680555555555556 | 278.603 |
| 0.6687500000000001 | 283.156 |
| 0.6694444444444444 | 278.603 |
| 0.6701388888888888 | 269.49 |
| 0.6708333333333334 | 264.932 |
| 0.6715277777777778 | 260.373 |
| 0.6722222222222222 | 251.251 |
| 0.6729166666666666 | 269.49 |
| 0.6736111111111112 | 242.127 |
| 0.6743055555555556 | 242.127 |
| 0.6749999999999999 | 287.709 |
| 0.6756944444444444 | 251.251 |
| 0.6763888888888889 | 242.127 |
| 0.6770833333333334 | 246.689 |
| 0.6777777777777777 | 210.182 |
| 0.6784722222222223 | 233 |
| 0.6791666666666667 | 187.378 |
| 0.6798611111111111 | 219.309 |
| 0.6805555555555555 | 173.709 |
| 0.68125 | 169.156 |
| 0.6819444444444445 | 164.605 |
| 0.6826388888888889 | 164.605 |
| 0.6833333333333332 | 160.056 |
| 0.6840277777777778 | 160.056 |
| 0.6847222222222222 | 155.509 |
| 0.6854166666666667 | 155.509 |
| 0.686111111111111 | 155.509 |
| 0.6868055555555556 | 146.423 |
| 0.6875 | 137.347 |
| 0.6881944444444444 | 128.284 |
| 0.688888888888889 | 123.758 |
| 0.6895833333333333 | 114.716 |
| 0.6902777777777778 | 110.201 |
| 0.6909722222222222 | 101.184 |
| 0.6916666666666668 | 92.184 |
| 0.6923611111111111 | 87.692 |
| 0.6930555555555555 | 83.205 |
| 0.69375 | 78.722 |
| 0.6944444444444445 | 74.246 |
| 0.6951388888888889 | 74.246 |
| 0.6958333333333333 | 74.246 |
| 0.6965277777777777 | 74.246 |
| 0.6972222222222223 | 74.246 |
| 0.6979166666666666 | 74.246 |
| 0.6986111111111111 | 74.246 |
| 0.6993055555555556 | 74.246 |
| 0.7000000000000001 | 74.246 |
| 0.7006944444444444 | 74.246 |
| 0.7013888888888888 | 74.246 |
| 0.7020833333333334 | 78.722 |
| 0.7027777777777778 | 83.205 |
| 0.7034722222222222 | 83.205 |
| 0.7041666666666666 | 87.692 |
| 0.7048611111111112 | 87.692 |
| 0.7055555555555556 | 83.205 |
| 0.7062499999999999 | 83.205 |
| 0.7069444444444444 | 83.205 |
| 0.7076388888888889 | 78.722 |
| 0.7083333333333334 | 74.246 |
| 0.7090277777777777 | 69.775 |
| 0.7097222222222223 | 69.775 |
| 0.7104166666666667 | 65.31 |
| 0.7111111111111111 | 60.85 |
| 0.7118055555555555 | 60.85 |
| 0.7125 | 56.398 |
| 0.7131944444444445 | 51.951 |
| 0.7138888888888889 | 47.511 |
| 0.7145833333333332 | 47.511 |
| 0.7152777777777778 | 43.079 |
| 0.7159722222222222 | 38.653 |
| 0.7166666666666667 | 38.653 |
| 0.717361111111111 | 34.234 |
| 0.7180555555555556 | 34.234 |
| 0.71875 | 34.234 |
| 0.7194444444444444 | 29.823 |
| 0.720138888888889 | 29.823 |
| 0.7208333333333333 | 29.823 |
| 0.7215277777777778 | 29.823 |
| 0.7222222222222222 | 29.823 |
| 0.7229166666666668 | 29.823 |
| 0.7236111111111111 | 34.234 |
| 0.7243055555555555 | 34.234 |
| 0.725 | 34.234 |
| 0.7256944444444445 | 34.234 |
| 0.7263888888888889 | 34.234 |
| 0.7270833333333333 | 34.234 |
| 0.7277777777777777 | 34.234 |
| 0.7284722222222223 | 34.234 |
| 0.7291666666666666 | 34.234 |
| 0.7298611111111111 | 34.234 |
| 0.7305555555555556 | 29.823 |
| 0.7312500000000001 | 29.823 |
| 0.7319444444444444 | 29.823 |
| 0.7326388888888888 | 25.419 |
| 0.7333333333333334 | 25.419 |
| 0.7340277777777778 | 21.024 |
| 0.7347222222222222 | 21.024 |
| 0.7354166666666666 | 16.636 |
| 0.7361111111111112 | 16.636 |
| 0.7368055555555556 | 16.636 |
| 0.7374999999999999 | 12.257 |
| 0.7381944444444444 | 12.257 |
| 0.7388888888888889 | 12.257 |
| 0.7395833333333334 | 12.257 |
| 0.7402777777777777 | 12.257 |
| 0.7409722222222223 | 12.257 |
| 0.7416666666666667 | 12.257 |
| 0.7423611111111111 | 12.257 |
| 0.7430555555555555 | 12.257 |
| 0.74375 | 12.257 |
| 0.7444444444444445 | 12.257 |
| 0.7451388888888889 | 12.257 |
| 0.7458333333333332 | 7.887 |
| 0.7465277777777778 | 12.257 |
| 0.7472222222222222 | 12.257 |
| 0.7479166666666667 | 12.257 |
| 0.748611111111111 | 12.257 |
| 0.7493055555555556 | 12.257 |
| 0.75 | 12.257 |
| 0.7506944444444444 | 12.257 |
| 0.751388888888889 | 12.257 |
| 0.7520833333333333 | 7.887 |
| 0.7527777777777778 | 12.257 |
| 0.7534722222222222 | 7.887 |
| 0.7541666666666668 | 7.887 |
| 0.7548611111111111 | 7.887 |
| 0.7555555555555555 | 7.887 |
| 0.75625 | 7.887 |
| 0.7569444444444445 | 7.887 |
| 0.7576388888888889 | 12.257 |
| 0.7583333333333333 | 12.257 |
| 0.7590277777777777 | 12.257 |
| 0.7597222222222223 | 12.257 |
| 0.7604166666666666 | 7.887 |
| 0.7611111111111111 | 7.887 |
| 0.7618055555555556 | 7.887 |
| 0.7625000000000001 | 7.887 |
| 0.7631944444444444 | 12.257 |
| 0.7638888888888888 | 7.887 |
| 0.7645833333333334 | 7.887 |
| 0.7652777777777778 | 7.887 |
| 0.7659722222222222 | 7.887 |
| 0.7666666666666666 | 7.887 |
| 0.7673611111111112 | 7.887 |
| 0.7680555555555556 | 7.887 |
| 0.7687499999999999 | 7.887 |
| 0.7694444444444444 | 7.887 |
| 0.7701388888888889 | 7.887 |
| 0.7708333333333334 | 7.887 |
| 0.7715277777777777 | 7.887 |
| 0.7722222222222223 | 7.887 |
| 0.7729166666666667 | 7.887 |
| 0.7736111111111111 | 7.887 |
| 0.7743055555555555 | 7.887 |
| 0.775 | 7.887 |
| 0.7756944444444445 | 7.887 |
| 0.7763888888888889 | 7.887 |
| 0.7770833333333332 | 7.887 |
| 0.7777777777777778 | 7.887 |
| 0.7784722222222222 | 7.887 |
| 0.7791666666666667 | 7.887 |
| 0.779861111111111 | 7.887 |
| 0.7805555555555556 | 7.887 |
| 0.78125 | 7.887 |
| 0.7819444444444444 | 7.887 |
| 0.782638888888889 | 7.887 |
| 0.7833333333333333 | 7.887 |
| 0.7840277777777778 | 7.887 |
| 0.7847222222222222 | 7.887 |
| 0.7854166666666668 | 3.525 |
| 0.7861111111111111 | 3.525 |
| 0.7868055555555555 | 3.525 |
| 0.7875 | 3.525 |
| 0.7881944444444445 | 3.525 |
| 0.7888888888888889 | 3.525 |
| 0.7895833333333333 | 3.525 |
| 0.7902777777777777 | 3.525 |
| 0.7909722222222223 | 3.525 |
| 0.7916666666666666 | 3.525 |
| 0.7923611111111111 | 3.525 |
| 0.7930555555555556 | 3.525 |
| 0.7937500000000001 | 7.887 |
| 0.7944444444444444 | 7.887 |
| 0.7951388888888888 | 7.887 |
| 0.7958333333333334 | 7.887 |
| 0.7965277777777778 | 7.887 |
| 0.7972222222222222 | 7.887 |
| 0.7979166666666666 | 7.887 |
| 0.7986111111111112 | 7.887 |
| 0.7993055555555556 | 7.887 |
| 0.7999999999999999 | 7.887 |
| 0.8006944444444444 | 7.887 |
| 0.8013888888888889 | 7.887 |
| 0.8020833333333334 | 7.887 |
| 0.8027777777777777 | 7.887 |
| 0.8034722222222223 | 7.887 |
| 0.8041666666666667 | 7.887 |
| 0.8048611111111111 | 7.887 |
| 0.8055555555555555 | 7.887 |
| 0.80625 | 7.887 |
| 0.8069444444444445 | 7.887 |
| 0.8076388888888889 | 7.887 |
| 0.8083333333333332 | 7.887 |
| 0.8090277777777778 | 7.887 |
| 0.8097222222222222 | 3.525 |
| 0.8104166666666667 | 3.525 |
| 0.811111111111111 | 3.525 |
| 0.8118055555555556 | 3.525 |
| 0.8125 | 3.525 |
| 0.8131944444444444 | 3.525 |
| 0.813888888888889 | 3.525 |
| 0.8145833333333333 | 3.525 |
| 0.8152777777777778 | 3.525 |
| 0.8159722222222222 | 0 |
| 0.8166666666666668 | 0 |
| 0.8173611111111111 | 0 |
| 0.8180555555555555 | 0 |
| 0.81875 | 0 |
| 0.8194444444444445 | 0 |
| 0.8201388888888889 | 0 |
| 0.8208333333333333 | 0 |
| 0.8215277777777777 | 0 |
| 0.8222222222222223 | 0 |
| 0.8229166666666666 | 0 |
| 0.8236111111111111 | 0 |
| 0.8243055555555556 | 0 |
| 0.8250000000000001 | 0 |
| 0.8256944444444444 | 0 |
| 0.8263888888888888 | 0 |
| 0.8270833333333334 | 0 |
| 0.8277777777777778 | 0 |
| 0.8284722222222222 | 0 |
| 0.8291666666666666 | 0 |
| 0.8298611111111112 | 0 |
| 0.8305555555555556 | 0 |
| 0.8312499999999999 | 0 |
| 0.8319444444444444 | 0 |
| 0.8326388888888889 | 0 |
| 0.8333333333333334 | 0 |
| 0.8340277777777777 | 0 |
| 0.8347222222222223 | 0 |
| 0.8354166666666667 | 0 |
| 0.8361111111111111 | 0 |
| 0.8368055555555555 | 0 |
| 0.8375 | 0 |
| 0.8381944444444445 | 0 |
| 0.8388888888888889 | 0 |
| 0.8395833333333332 | 0 |
| 0.8402777777777778 | 0 |
| 0.8409722222222222 | 0 |
| 0.8416666666666667 | 0 |
| 0.842361111111111 | 0 |
| 0.8430555555555556 | 0 |
| 0.84375 | 0 |
| 0.8444444444444444 | 0 |
| 0.845138888888889 | 0 |
| 0.8458333333333333 | 0 |
| 0.8465277777777778 | 0 |
| 0.8472222222222222 | 0 |
| 0.8479166666666668 | 0 |
| 0.8486111111111111 | 0 |
| 0.8493055555555555 | 0 |
| 0.85 | 0 |
| 0.8506944444444445 | 0 |
| 0.8513888888888889 | 0 |
| 0.8520833333333333 | 0 |
| 0.8527777777777777 | 0 |
| 0.8534722222222223 | 0 |
| 0.8541666666666666 | 0 |
| 0.8548611111111111 | 0 |
| 0.8555555555555556 | 0 |
| 0.8562500000000001 | 0 |
| 0.8569444444444444 | 0 |
| 0.8576388888888888 | 0 |
| 0.8583333333333334 | 0 |
| 0.8590277777777778 | 0 |
| 0.8597222222222222 | 0 |
| 0.8604166666666666 | 0 |
| 0.8611111111111112 | 0 |
| 0.8618055555555556 | 0 |
| 0.8624999999999999 | 0 |
| 0.8631944444444444 | 0 |
| 0.8638888888888889 | 0 |
| 0.8645833333333334 | 0 |
| 0.8652777777777777 | 0 |
| 0.8659722222222223 | 0 |
| 0.8666666666666667 | 0 |
| 0.8673611111111111 | 0 |
| 0.8680555555555555 | 0 |
| 0.86875 | 0 |
| 0.8694444444444445 | 0 |
| 0.8701388888888889 | 0 |
| 0.8708333333333332 | 0 |
| 0.8715277777777778 | 0 |
| 0.8722222222222222 | 0 |
| 0.8729166666666667 | 0 |
| 0.873611111111111 | 0 |
| 0.8743055555555556 | 0 |
| 0.875 | 0 |
| 0.8756944444444444 | 0 |
| 0.876388888888889 | 0 |
| 0.8770833333333333 | 0 |
| 0.8777777777777778 | 0 |
| 0.8784722222222222 | 0 |
| 0.8791666666666668 | 0 |
| 0.8798611111111111 | 0 |
| 0.8805555555555555 | 0 |
| 0.88125 | 0 |
| 0.8819444444444445 | 0 |
| 0.8826388888888889 | 0 |
| 0.8833333333333333 | 0 |
| 0.8840277777777777 | 0 |
| 0.8847222222222223 | 0 |
| 0.8854166666666666 | 0 |
| 0.8861111111111111 | 0 |
| 0.8868055555555556 | 0 |
| 0.8875000000000001 | 0 |
| 0.8881944444444444 | 0 |
| 0.8888888888888888 | 0 |
| 0.8895833333333334 | 0 |
| 0.8902777777777778 | 0 |
| 0.8909722222222222 | 0 |
| 0.8916666666666666 | 0 |
| 0.8923611111111112 | 0 |
| 0.8930555555555556 | 0 |
| 0.8937499999999999 | 0 |
| 0.8944444444444444 | 0 |
| 0.8951388888888889 | 0 |
| 0.8958333333333334 | 0 |
| 0.8965277777777777 | 0 |
| 0.8972222222222223 | 0 |
| 0.8979166666666667 | 0 |
| 0.8986111111111111 | 0 |
| 0.8993055555555555 | 0 |
| 0.9 | 0 |
| 0.9006944444444445 | 0 |
| 0.9013888888888889 | 0 |
| 0.9020833333333332 | 0 |
| 0.9027777777777778 | 0 |
| 0.9034722222222222 | 0 |
| 0.9041666666666667 | 0 |
| 0.904861111111111 | 0 |
| 0.9055555555555556 | 0 |
| 0.90625 | 0 |
| 0.9069444444444444 | 0 |
| 0.907638888888889 | 0 |
| 0.9083333333333333 | 0 |
| 0.9090277777777778 | 0 |
| 0.9097222222222222 | 0 |
| 0.9104166666666668 | 0 |
| 0.9111111111111111 | 0 |
| 0.9118055555555555 | 0 |
| 0.9125 | 0 |
| 0.9131944444444445 | 0 |
| 0.9138888888888889 | 0 |
| 0.9145833333333333 | 0 |
| 0.9152777777777777 | 0 |
| 0.9159722222222223 | 0 |
| 0.9166666666666666 | 0 |
| 0.9173611111111111 | 0 |
| 0.9180555555555556 | 0 |
| 0.9187500000000001 | 0 |
| 0.9194444444444444 | 0 |
| 0.9201388888888888 | 0 |
| 0.9208333333333334 | 0 |
| 0.9215277777777778 | 0 |
| 0.9222222222222222 | 0 |
| 0.9229166666666666 | 0 |
| 0.9236111111111112 | 0 |
| 0.9243055555555556 | 0 |
| 0.9249999999999999 | 0 |
| 0.9256944444444444 | 0 |
| 0.9263888888888889 | 0 |
| 0.9270833333333334 | 0 |
| 0.9277777777777777 | 0 |
| 0.9284722222222223 | 0 |
| 0.9291666666666667 | 0 |
| 0.9298611111111111 | 0 |
| 0.9305555555555555 | 0 |
| 0.93125 | 0 |
| 0.9319444444444445 | 0 |
| 0.9326388888888889 | 0 |
| 0.9333333333333332 | 0 |
| 0.9340277777777778 | 0 |
| 0.9347222222222222 | 0 |
| 0.9354166666666667 | 0 |
| 0.936111111111111 | 0 |
| 0.9368055555555556 | 0 |
| 0.9375 | 0 |
| 0.9381944444444444 | 0 |
| 0.938888888888889 | 0 |
| 0.9395833333333333 | 0 |
| 0.9402777777777778 | 0 |
| 0.9409722222222222 | 0 |
| 0.9416666666666668 | 0 |
| 0.9423611111111111 | 0 |
| 0.9430555555555555 | 0 |
| 0.94375 | 0 |
| 0.9444444444444445 | 0 |
| 0.9451388888888889 | 0 |
| 0.9458333333333333 | 0 |
| 0.9465277777777777 | 0 |
| 0.9472222222222223 | 0 |
| 0.9479166666666666 | 0 |
| 0.9486111111111111 | 0 |
| 0.9493055555555556 | 0 |
| 0.9500000000000001 | 0 |
| 0.9506944444444444 | 0 |
| 0.9513888888888888 | 0 |
| 0.9520833333333334 | 0 |
| 0.9527777777777778 | 0 |
| 0.9534722222222222 | 0 |
| 0.9541666666666666 | 0 |
| 0.9548611111111112 | 0 |
| 0.9555555555555556 | 0 |
| 0.9562499999999999 | 0 |
| 0.9569444444444444 | 0 |
| 0.9576388888888889 | 0 |
| 0.9583333333333334 | 0 |
| 0.9590277777777777 | 0 |
| 0.9597222222222223 | 0 |
| 0.9604166666666667 | 0 |
| 0.9611111111111111 | 0 |
| 0.9618055555555555 | 0 |
| 0.9625 | 0 |
| 0.9631944444444445 | 0 |
| 0.9638888888888889 | 0 |
| 0.9645833333333332 | 0 |
| 0.9652777777777778 | 0 |
| 0.9659722222222222 | 0 |
| 0.9666666666666667 | 0 |
| 0.967361111111111 | 0 |
| 0.9680555555555556 | 0 |
| 0.96875 | 0 |
| 0.9694444444444444 | 0 |
| 0.970138888888889 | 0 |
| 0.9708333333333333 | 0 |
| 0.9715277777777778 | 0 |
| 0.9722222222222222 | 0 |
| 0.9729166666666668 | 0 |
| 0.9736111111111111 | 0 |
| 0.9743055555555555 | 0 |
| 0.975 | 0 |
| 0.9756944444444445 | 0 |
| 0.9763888888888889 | 0 |
| 0.9770833333333333 | 0 |
| 0.9777777777777777 | 0 |
| 0.9784722222222223 | 0 |
| 0.9791666666666666 | 0 |
| 0.9798611111111111 | 0 |
| 0.9805555555555556 | 0 |
| 0.9812500000000001 | 0 |
| 0.9819444444444444 | 0 |
| 0.9826388888888888 | 0 |
| 0.9833333333333334 | 0 |
| 0.9840277777777778 | 0 |
| 0.9847222222222222 | 0 |
| 0.9854166666666666 | 0 |
| 0.9861111111111112 | 0 |
| 0.9868055555555556 | 0 |
| 0.9874999999999999 | 0 |
| 0.9881944444444444 | 0 |
| 0.9888888888888889 | 0 |
| 0.9895833333333334 | 0 |
| 0.9902777777777777 | 0 |
| 0.9909722222222223 | 0 |
| 0.9916666666666667 | 0 |
| 0.9923611111111111 | 0 |
| 0.9930555555555555 | 0 |
| 0.99375 | 0 |
| 0.9944444444444445 | 0 |
| 0.9951388888888889 | 0 |
| 0.9958333333333332 | 0 |
| 0.9965277777777778 | 0 |
| 0.9972222222222222 | 0 |
| 0.9979166666666667 | 0 |
| 0.998611111111111 | 0 |
| 0.9993055555555556 | 0 |